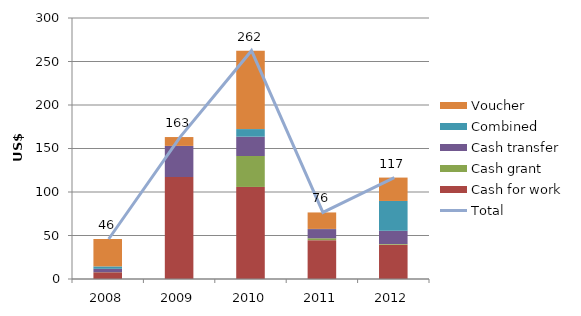
| Category | Cash for work | Cash grant | Cash transfer | Combined | Voucher |
|---|---|---|---|---|---|
| 2008.0 | 7.73 | 0.105 | 3.889 | 2.76 | 31.479 |
| 2009.0 | 117.234 | 0 | 35.742 | 0 | 10.185 |
| 2010.0 | 105.805 | 35.571 | 22.21 | 8.718 | 90.117 |
| 2011.0 | 44.673 | 2.139 | 10.555 | 0.191 | 18.939 |
| 2012.0 | 39.441 | 0.761 | 15.222 | 34.279 | 26.878 |